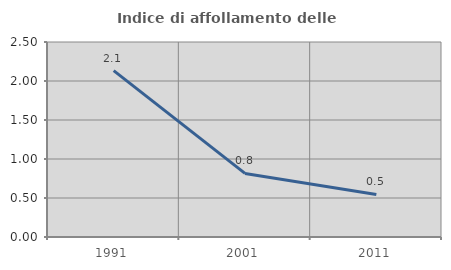
| Category | Indice di affollamento delle abitazioni  |
|---|---|
| 1991.0 | 2.133 |
| 2001.0 | 0.815 |
| 2011.0 | 0.545 |